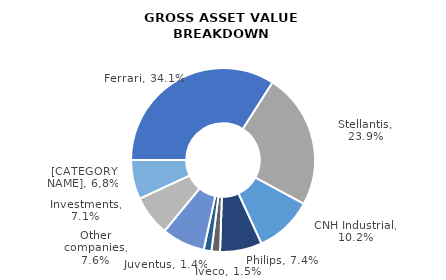
| Category | 31 Dec 2023 |
|---|---|
| Ferrari | 13562 |
| Stellantis | 9505 |
| CNH Industrial | 4066 |
| Philips | 2937 |
| Iveco | 598 |
| Juventus | 542 |
| Other companies | 3023 |
| Investments | 2836 |
| Others | 2750 |